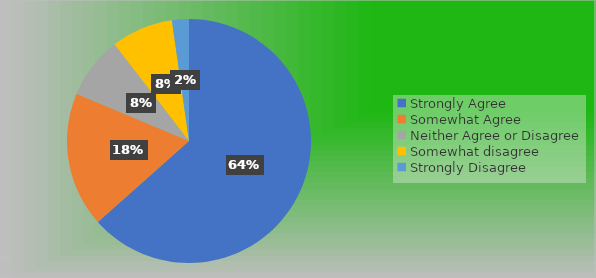
| Category | Series 0 |
|---|---|
| Strongly Agree | 85 |
| Somewhat Agree | 24 |
| Neither Agree or Disagree | 11 |
| Somewhat disagree | 11 |
| Strongly Disagree | 3 |